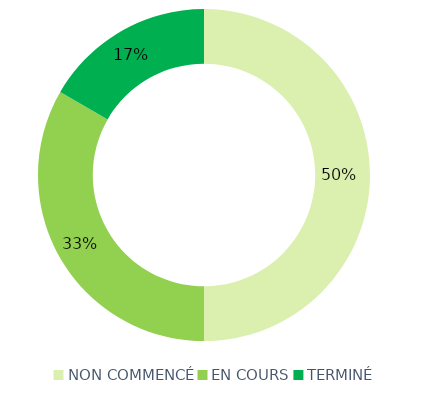
| Category | Series 0 |
|---|---|
| NON COMMENCÉ | 3 |
| EN COURS | 2 |
| TERMINÉ | 1 |